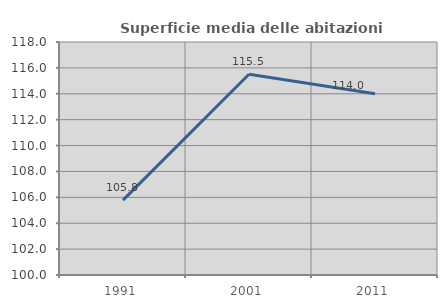
| Category | Superficie media delle abitazioni occupate |
|---|---|
| 1991.0 | 105.782 |
| 2001.0 | 115.507 |
| 2011.0 | 114.008 |